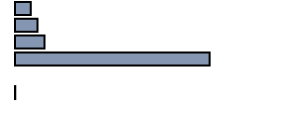
| Category | Series 0 |
|---|---|
| 0 | 6 |
| 1 | 8.6 |
| 2 | 11.2 |
| 3 | 74 |
| 4 | 0 |
| 5 | 0.1 |